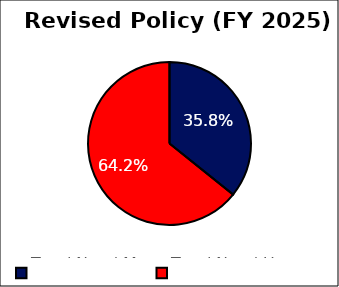
| Category | Revised
Policy |
|---|---|
| Total Need Met | 0.358 |
| Total Need Unmet | 0.642 |